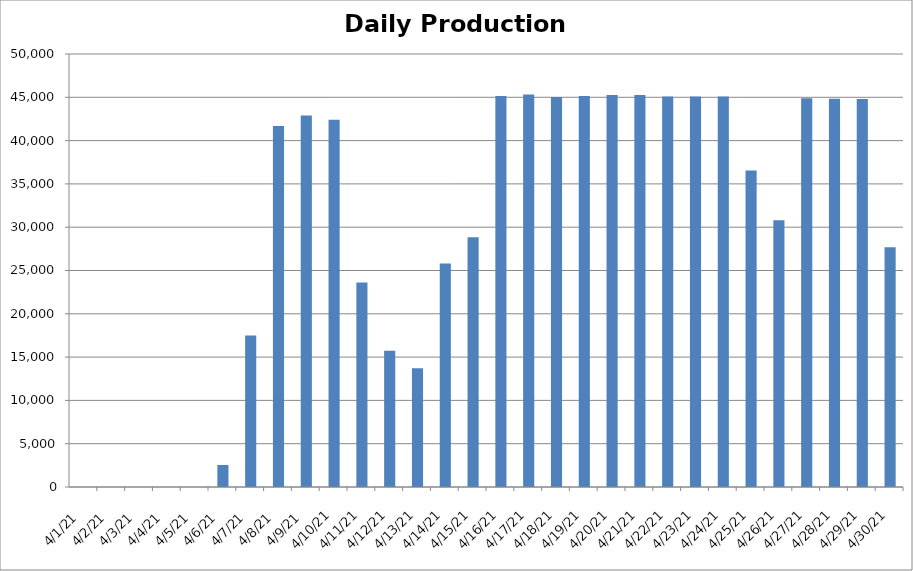
| Category | Cogen Daily Production (kWh) |
|---|---|
| 4/1/21 | 0 |
| 4/2/21 | 0 |
| 4/3/21 | 0 |
| 4/4/21 | 0 |
| 4/5/21 | 0 |
| 4/6/21 | 2541.25 |
| 4/7/21 | 17482 |
| 4/8/21 | 41693.75 |
| 4/9/21 | 42886.75 |
| 4/10/21 | 42410.5 |
| 4/11/21 | 23602.75 |
| 4/12/21 | 15719.75 |
| 4/13/21 | 13709 |
| 4/14/21 | 25795.5 |
| 4/15/21 | 28852.75 |
| 4/16/21 | 45159.25 |
| 4/17/21 | 45337 |
| 4/18/21 | 45028 |
| 4/19/21 | 45160.25 |
| 4/20/21 | 45253.25 |
| 4/21/21 | 45272.25 |
| 4/22/21 | 45083.5 |
| 4/23/21 | 45087.25 |
| 4/24/21 | 45097.75 |
| 4/25/21 | 36542.5 |
| 4/26/21 | 30802.5 |
| 4/27/21 | 44898.75 |
| 4/28/21 | 44831 |
| 4/29/21 | 44803.75 |
| 4/30/21 | 27696 |